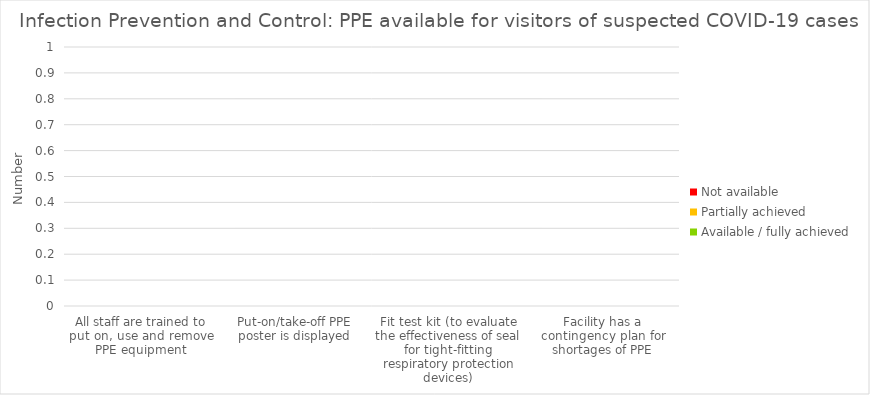
| Category | Available / fully achieved | Partially achieved | Not available |
|---|---|---|---|
| All staff are trained to put on, use and remove PPE equipment | 0 | 0 | 0 |
| Put-on/take-off PPE poster is displayed | 0 | 0 | 0 |
| Fit test kit (to evaluate the effectiveness of seal for tight-fitting respiratory protection devices) | 0 | 0 | 0 |
| Facility has a contingency plan for shortages of PPE | 0 | 0 | 0 |